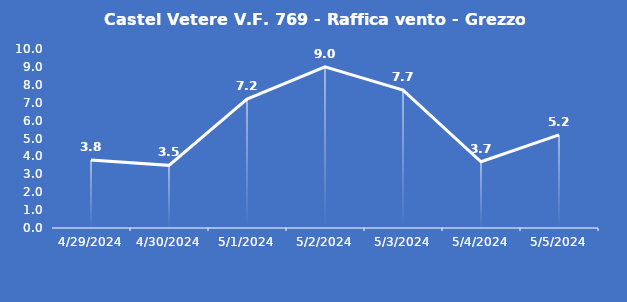
| Category | Castel Vetere V.F. 769 - Raffica vento - Grezzo (m/s) |
|---|---|
| 4/29/24 | 3.8 |
| 4/30/24 | 3.5 |
| 5/1/24 | 7.2 |
| 5/2/24 | 9 |
| 5/3/24 | 7.7 |
| 5/4/24 | 3.7 |
| 5/5/24 | 5.2 |